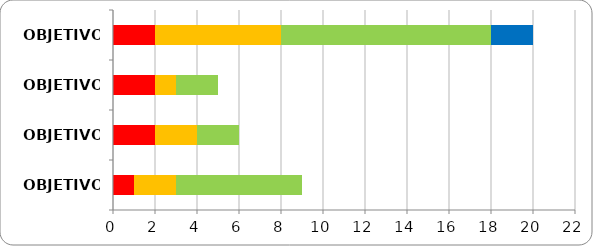
| Category | Series 0 | Series 1 | Series 2 | Series 3 | Series 4 |
|---|---|---|---|---|---|
| OBJETIVO 1 | 0 | 2 | 6 | 10 | 2 |
| OBJETIVO 2 | 0 | 2 | 1 | 2 | 0 |
| OBJETIVO 3 | 0 | 2 | 2 | 2 | 0 |
| OBJETIVO 4 | 0 | 1 | 2 | 6 | 0 |